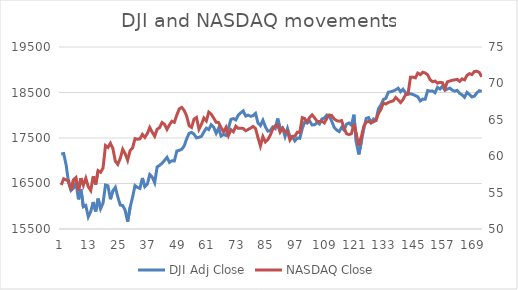
| Category | DJI Adj Close |
|---|---|
| 0 | 17148.939 |
| 1 | 17158.66 |
| 2 | 16906.51 |
| 3 | 16514.1 |
| 4 | 16346.45 |
| 5 | 16398.57 |
| 6 | 16516.221 |
| 7 | 16151.41 |
| 8 | 16379.05 |
| 9 | 15988.08 |
| 10 | 16016.02 |
| 11 | 15766.74 |
| 12 | 15882.68 |
| 13 | 16093.51 |
| 14 | 15885.22 |
| 15 | 16167.23 |
| 16 | 15944.46 |
| 17 | 16069.64 |
| 18 | 16466.301 |
| 19 | 16449.18 |
| 20 | 16153.54 |
| 21 | 16336.66 |
| 22 | 16416.58 |
| 23 | 16204.97 |
| 24 | 16027.05 |
| 25 | 16014.38 |
| 26 | 15914.74 |
| 27 | 15660.18 |
| 28 | 15973.84 |
| 29 | 16196.41 |
| 30 | 16453.83 |
| 31 | 16413.43 |
| 32 | 16391.99 |
| 33 | 16620.66 |
| 34 | 16431.779 |
| 35 | 16484.99 |
| 36 | 16697.289 |
| 37 | 16639.971 |
| 38 | 16516.5 |
| 39 | 16865.08 |
| 40 | 16899.32 |
| 41 | 16943.9 |
| 42 | 17006.77 |
| 43 | 17073.949 |
| 44 | 16964.1 |
| 45 | 17000.359 |
| 46 | 16995.131 |
| 47 | 17213.311 |
| 48 | 17229.131 |
| 49 | 17251.529 |
| 50 | 17325.76 |
| 51 | 17481.49 |
| 52 | 17602.301 |
| 53 | 17623.869 |
| 54 | 17582.57 |
| 55 | 17502.59 |
| 56 | 17515.73 |
| 57 | 17535.391 |
| 58 | 17633.109 |
| 59 | 17716.66 |
| 60 | 17685.09 |
| 61 | 17792.75 |
| 62 | 17737 |
| 63 | 17603.32 |
| 64 | 17716.051 |
| 65 | 17541.961 |
| 66 | 17576.961 |
| 67 | 17556.41 |
| 68 | 17721.25 |
| 69 | 17908.279 |
| 70 | 17926.43 |
| 71 | 17897.461 |
| 72 | 18004.16 |
| 73 | 18053.6 |
| 74 | 18096.27 |
| 75 | 17982.52 |
| 76 | 18003.75 |
| 77 | 17977.24 |
| 78 | 17990.32 |
| 79 | 18041.551 |
| 80 | 17830.76 |
| 81 | 17773.641 |
| 82 | 17891.16 |
| 83 | 17750.91 |
| 84 | 17651.26 |
| 85 | 17660.711 |
| 86 | 17740.631 |
| 87 | 17705.91 |
| 88 | 17928.35 |
| 89 | 17711.119 |
| 90 | 17720.5 |
| 91 | 17535.32 |
| 92 | 17710.711 |
| 93 | 17529.98 |
| 94 | 17526.619 |
| 95 | 17435.4 |
| 96 | 17500.939 |
| 97 | 17492.93 |
| 98 | 17706.051 |
| 99 | 17851.51 |
| 100 | 17828.289 |
| 101 | 17873.221 |
| 102 | 17787.199 |
| 103 | 17789.67 |
| 104 | 17838.561 |
| 105 | 17807.061 |
| 106 | 17920.33 |
| 107 | 17938.279 |
| 108 | 18005.051 |
| 109 | 17985.189 |
| 110 | 17865.34 |
| 111 | 17732.48 |
| 112 | 17674.82 |
| 113 | 17640.17 |
| 114 | 17733.1 |
| 115 | 17675.16 |
| 116 | 17804.869 |
| 117 | 17829.73 |
| 118 | 17780.83 |
| 119 | 18011.07 |
| 120 | 17400.75 |
| 121 | 17140.24 |
| 122 | 17409.721 |
| 123 | 17694.68 |
| 124 | 17929.99 |
| 125 | 17949.369 |
| 126 | 17840.619 |
| 127 | 17918.619 |
| 128 | 17895.881 |
| 129 | 18146.74 |
| 130 | 18226.93 |
| 131 | 18347.67 |
| 132 | 18372.119 |
| 133 | 18506.41 |
| 134 | 18516.551 |
| 135 | 18533.051 |
| 136 | 18559.01 |
| 137 | 18595.029 |
| 138 | 18517.23 |
| 139 | 18570.85 |
| 140 | 18493.061 |
| 141 | 18473.75 |
| 142 | 18472.17 |
| 143 | 18456.35 |
| 144 | 18432.24 |
| 145 | 18404.51 |
| 146 | 18313.77 |
| 147 | 18355 |
| 148 | 18352.051 |
| 149 | 18543.529 |
| 150 | 18529.289 |
| 151 | 18533.051 |
| 152 | 18495.66 |
| 153 | 18613.52 |
| 154 | 18576.471 |
| 155 | 18636.051 |
| 156 | 18552.02 |
| 157 | 18573.939 |
| 158 | 18597.699 |
| 159 | 18552.57 |
| 160 | 18529.42 |
| 161 | 18547.301 |
| 162 | 18481.48 |
| 163 | 18448.41 |
| 164 | 18395.4 |
| 165 | 18502.99 |
| 166 | 18454.301 |
| 167 | 18400.881 |
| 168 | 18419.301 |
| 169 | 18491.961 |
| 170 | 18538.119 |
| 171 | 18526.141 |